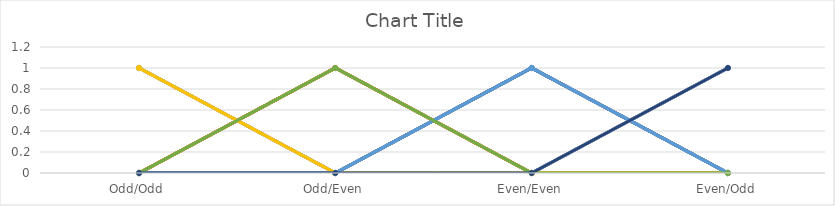
| Category | Series 0 | Series 1 | Series 2 | Series 3 | Series 4 | Series 5 | Series 6 | Series 7 | Series 8 | Series 9 | Series 10 | Series 11 | Series 12 | Series 13 | Series 14 | Series 15 | Series 16 | Series 17 | Series 18 | Series 19 | Series 20 | Series 21 | Series 22 | Series 23 | Series 24 | Series 25 | Series 26 | Series 27 | Series 28 | Series 29 | Series 30 | Series 31 | Series 32 | Series 33 | Series 34 | Series 35 | Series 36 | Series 37 | Series 38 | Series 39 | Series 40 | Series 41 | Series 42 | Series 43 | Series 44 | Series 45 | Series 46 | Series 47 | Series 48 | Series 49 | Series 50 | Series 51 | Series 52 | Series 53 | Series 54 | Series 55 | Series 56 | Series 57 | Series 58 | Series 59 | Series 60 |
|---|---|---|---|---|---|---|---|---|---|---|---|---|---|---|---|---|---|---|---|---|---|---|---|---|---|---|---|---|---|---|---|---|---|---|---|---|---|---|---|---|---|---|---|---|---|---|---|---|---|---|---|---|---|---|---|---|---|---|---|---|---|
| Odd/Odd | 0 | 1 | 0 | 0 | 0 | 1 | 0 | 0 | 0 | 1 | 0 | 0 | 0 | 1 | 0 | 0 | 0 | 1 | 0 | 0 | 0 | 1 | 0 | 0 | 0 | 1 | 0 | 0 | 0 | 1 | 0 | 0 | 0 | 1 | 0 | 0 | 0 | 1 | 0 | 0 | 0 | 1 | 0 | 0 | 0 | 1 | 0 | 0 | 0 | 1 | 0 | 0 | 0 | 1 | 0 | 0 | 0 | 1 | 0 | 0 | 0 |
| Odd/Even | 0 | 0 | 0 | 1 | 0 | 0 | 0 | 1 | 0 | 0 | 0 | 1 | 0 | 0 | 0 | 1 | 0 | 0 | 0 | 1 | 0 | 0 | 0 | 1 | 0 | 0 | 0 | 1 | 0 | 0 | 0 | 1 | 0 | 0 | 0 | 1 | 0 | 0 | 0 | 1 | 0 | 0 | 0 | 1 | 0 | 0 | 0 | 1 | 0 | 0 | 0 | 1 | 0 | 0 | 0 | 1 | 0 | 0 | 0 | 1 | 0 |
| Even/Even | 0 | 0 | 1 | 0 | 0 | 0 | 1 | 0 | 0 | 0 | 1 | 0 | 0 | 0 | 1 | 0 | 0 | 0 | 1 | 0 | 0 | 0 | 1 | 0 | 0 | 0 | 1 | 0 | 0 | 0 | 1 | 0 | 0 | 0 | 1 | 0 | 0 | 0 | 1 | 0 | 0 | 0 | 1 | 0 | 0 | 0 | 1 | 0 | 0 | 0 | 1 | 0 | 0 | 0 | 1 | 0 | 0 | 0 | 1 | 0 | 0 |
| Even/Odd | 1 | 0 | 0 | 0 | 1 | 0 | 0 | 0 | 1 | 0 | 0 | 0 | 1 | 0 | 0 | 0 | 1 | 0 | 0 | 0 | 1 | 0 | 0 | 0 | 1 | 0 | 0 | 0 | 1 | 0 | 0 | 0 | 1 | 0 | 0 | 0 | 1 | 0 | 0 | 0 | 1 | 0 | 0 | 0 | 1 | 0 | 0 | 0 | 1 | 0 | 0 | 0 | 1 | 0 | 0 | 0 | 1 | 0 | 0 | 0 | 1 |